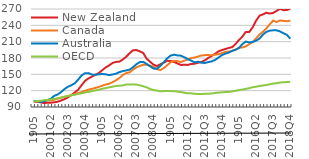
| Category | New Zealand | Canada | Australia | OECD |
|---|---|---|---|---|
| 2000 | 100 | 100 | 100 | 100 |
| 2000Q2 | 99.599 | 100.591 | 101.132 | 100.929 |
| 2000Q3 | 98.625 | 100.848 | 98.934 | 101.385 |
| 2000Q4 | 97.147 | 101.187 | 100.664 | 102.361 |
| 2001 | 97.863 | 102.277 | 102.525 | 103.057 |
| 2001Q2 | 97.936 | 101.967 | 105.052 | 103.703 |
| 2001Q3 | 98.605 | 103.429 | 110.506 | 104.878 |
| 2001Q4 | 99.677 | 105.362 | 112.959 | 105.912 |
| 2002 | 101.892 | 107.02 | 117.329 | 107.304 |
| 2002Q2 | 104.345 | 108.852 | 123.006 | 108.792 |
| 2002Q3 | 107.741 | 110.149 | 127.07 | 110.194 |
| 2002Q4 | 111.733 | 111.72 | 130.018 | 111.552 |
| 2003 | 116.676 | 113.685 | 133.56 | 112.398 |
| 2003Q2 | 121.934 | 115.619 | 140.288 | 114.046 |
| 2003Q3 | 129.983 | 117.137 | 148.026 | 115.118 |
| 2003Q4 | 137.963 | 119.906 | 152.073 | 116.73 |
| 2004 | 142.508 | 121.881 | 152.225 | 117.814 |
| 2004Q2 | 145.756 | 123.303 | 149.592 | 119.067 |
| 2004Q3 | 149.21 | 125.073 | 149.085 | 120.492 |
| 2004Q4 | 152.227 | 126.812 | 149.97 | 121.672 |
| 2005 | 157.446 | 128.979 | 150.589 | 123.409 |
| 2005Q2 | 162.494 | 131.2 | 150.079 | 124.665 |
| 2005Q3 | 166.157 | 132.488 | 148.635 | 126.123 |
| 2005Q4 | 170.695 | 135.454 | 149.627 | 127.356 |
| 2006 | 172.783 | 138.858 | 151.046 | 128.515 |
| 2006Q2 | 173.25 | 142.967 | 153.958 | 129.155 |
| 2006Q3 | 176.921 | 148.582 | 155.848 | 129.442 |
| 2006Q4 | 182.108 | 152.174 | 157.1 | 131.232 |
| 2007 | 188.577 | 153.548 | 158.628 | 131.395 |
| 2007Q2 | 194.047 | 158.408 | 162.784 | 131.596 |
| 2007Q3 | 194.661 | 162.703 | 168.438 | 131.193 |
| 2007Q4 | 192.224 | 165.396 | 172.462 | 129.888 |
| 2008 | 189.224 | 167.478 | 172.872 | 128.06 |
| 2008Q2 | 178.974 | 167.874 | 169.144 | 126.08 |
| 2008Q3 | 173.137 | 165.826 | 164.867 | 123.066 |
| 2008Q4 | 167.905 | 164 | 160.628 | 121.11 |
| 2009 | 165.186 | 159.966 | 160.096 | 120.268 |
| 2009Q2 | 168.301 | 157.718 | 165.244 | 119.019 |
| 2009Q3 | 171.327 | 161.269 | 172.142 | 119.131 |
| 2009Q4 | 174.828 | 166.604 | 179.283 | 119.495 |
| 2010 | 174.476 | 172.158 | 184.384 | 119.174 |
| 2010Q2 | 172.823 | 174.715 | 186.096 | 119.069 |
| 2010Q3 | 169.977 | 174.298 | 184.837 | 118.325 |
| 2010Q4 | 167.22 | 172.511 | 184.293 | 117.608 |
| 2011 | 167.556 | 175.1 | 181.369 | 116.136 |
| 2011Q2 | 167.299 | 177.133 | 178.103 | 115.254 |
| 2011Q3 | 168.928 | 179.859 | 175.295 | 115.043 |
| 2011Q4 | 169.459 | 180.897 | 172.011 | 114.32 |
| 2012 | 171.238 | 182.557 | 173.176 | 113.907 |
| 2012Q2 | 172.641 | 184.564 | 171.428 | 114.02 |
| 2012Q3 | 175.538 | 185.311 | 170.843 | 114.169 |
| 2012Q4 | 179.957 | 185.331 | 172.449 | 114.437 |
| 2013 | 183.72 | 184.95 | 173.753 | 114.748 |
| 2013Q2 | 187.551 | 186.084 | 176.492 | 115.814 |
| 2013Q3 | 192.164 | 186.844 | 180.549 | 116.36 |
| 2013Q4 | 194.563 | 188.932 | 185.291 | 116.915 |
| 2014 | 196.455 | 191.155 | 187.98 | 117.408 |
| 2014Q2 | 198.446 | 191.765 | 189.837 | 117.774 |
| 2014Q3 | 199.897 | 193.036 | 193.109 | 118.528 |
| 2014Q4 | 205.615 | 195.456 | 195.073 | 119.703 |
| 2015 | 213.132 | 198.75 | 198.477 | 121.187 |
| 2015Q2 | 219.408 | 199.401 | 205.489 | 122.015 |
| 2015Q3 | 227.85 | 201.328 | 210.252 | 123.383 |
| 2015Q4 | 227.746 | 205.351 | 208.547 | 124.518 |
| 2016Q1 | 236.378 | 209.46 | 209.525 | 126.271 |
| 2016Q2 | 248.453 | 215.826 | 211.854 | 127.284 |
| 2016Q3 | 257.614 | 223.047 | 215.653 | 128.58 |
| 2016Q4 | 260.139 | 228.181 | 222.867 | 129.472 |
| 2017Q1 | 263.106 | 234.293 | 227.914 | 130.378 |
| 2017Q2 | 261.616 | 241.932 | 230.247 | 131.735 |
| 2017Q3 | 262.821 | 248.535 | 230.87 | 132.974 |
| 2017Q4 | 266.467 | 246.257 | 230.835 | 133.745 |
| 2018 | 270.414 | 248.98 | 228.784 | 134.935 |
| 2018Q2 | 267.891 | 248.193 | 225.516 | 135.451 |
| 2018Q3 | 267.993 | 247.547 | 222.521 | 135.8 |
| 2018Q4 | 270.651 | 248.61 | 215.396 | 136.283 |